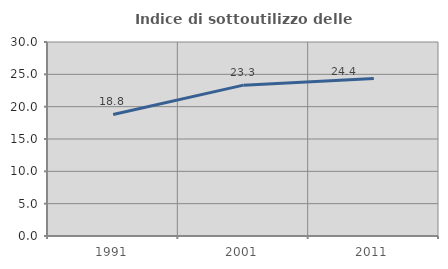
| Category | Indice di sottoutilizzo delle abitazioni  |
|---|---|
| 1991.0 | 18.796 |
| 2001.0 | 23.328 |
| 2011.0 | 24.358 |